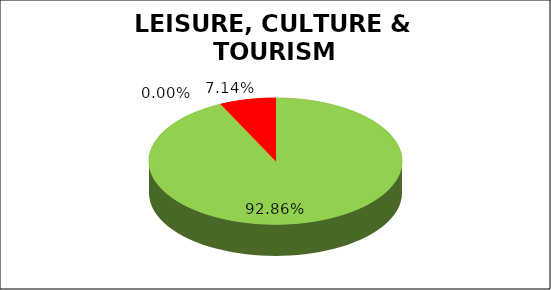
| Category | Q2 |
|---|---|
| Green | 0.929 |
| Amber | 0 |
| Red | 0.071 |